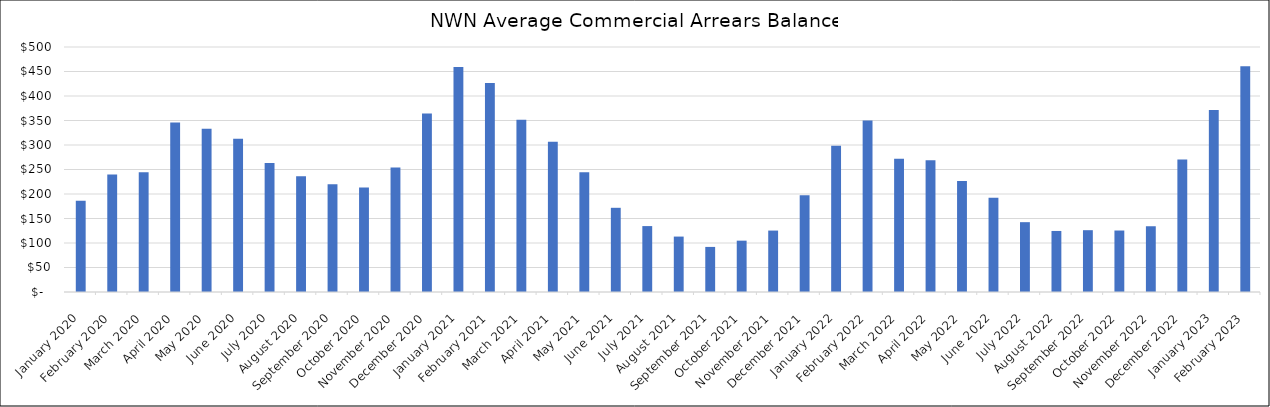
| Category | Average Arrears Balance |
|---|---|
| 2020-01-01 | 186.205 |
| 2020-02-01 | 239.864 |
| 2020-03-01 | 244.525 |
| 2020-04-01 | 345.725 |
| 2020-05-01 | 333.133 |
| 2020-06-01 | 312.707 |
| 2020-07-01 | 263.453 |
| 2020-08-01 | 236.168 |
| 2020-09-01 | 219.891 |
| 2020-10-01 | 213.406 |
| 2020-11-01 | 254.171 |
| 2020-12-01 | 364.526 |
| 2021-01-01 | 459.14 |
| 2021-02-01 | 426.409 |
| 2021-03-01 | 351.489 |
| 2021-04-01 | 306.847 |
| 2021-05-01 | 244.285 |
| 2021-06-01 | 171.832 |
| 2021-07-01 | 134.532 |
| 2021-08-01 | 113.113 |
| 2021-09-01 | 91.999 |
| 2021-10-01 | 104.78 |
| 2021-11-01 | 125.368 |
| 2021-12-01 | 197.432 |
| 2022-01-01 | 298.679 |
| 2022-02-01 | 349.841 |
| 2022-03-01 | 272.175 |
| 2022-04-01 | 268.911 |
| 2022-05-01 | 226.567 |
| 2022-06-01 | 192.45 |
| 2022-07-01 | 142.516 |
| 2022-08-01 | 124.57 |
| 2022-09-01 | 126.139 |
| 2022-10-01 | 125.477 |
| 2022-11-01 | 134.183 |
| 2022-12-01 | 270.605 |
| 2023-01-01 | 371.332 |
| 2023-02-01 | 460.843 |